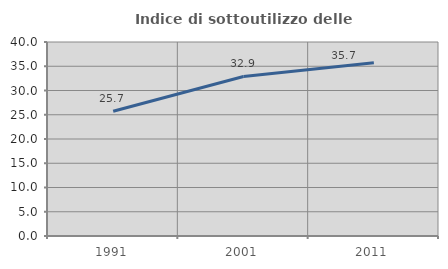
| Category | Indice di sottoutilizzo delle abitazioni  |
|---|---|
| 1991.0 | 25.724 |
| 2001.0 | 32.9 |
| 2011.0 | 35.703 |